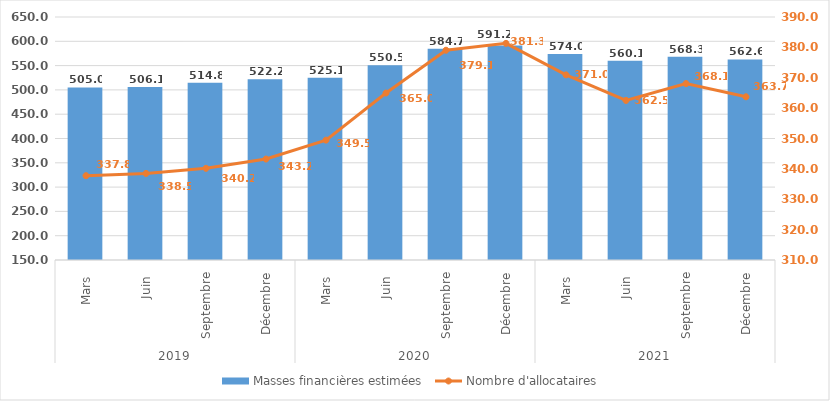
| Category | Masses financières estimées |
|---|---|
| 0 | 504.972 |
| 1 | 506.134 |
| 2 | 514.759 |
| 3 | 522.168 |
| 4 | 525.113 |
| 5 | 550.484 |
| 6 | 584.676 |
| 7 | 591.226 |
| 8 | 574.035 |
| 9 | 560.134 |
| 10 | 568.254 |
| 11 | 562.624 |